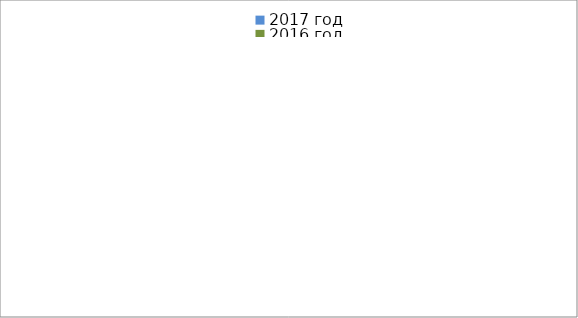
| Category | 2017 год | 2016 год |
|---|---|---|
|  - поджог | 3 | 22 |
|  - неосторожное обращение с огнём | 2 | 17 |
|  - НПТЭ электрооборудования | 7 | 4 |
|  - НПУ и Э печей | 21 | 21 |
|  - НПУ и Э транспортных средств | 32 | 9 |
|   -Шалость с огнем детей | 4 | 4 |
|  -НППБ при эксплуатации эл.приборов | 17 | 4 |
|  - курение | 18 | 6 |
| - прочие | 32 | 43 |
| - не установленные причины | 0 | 11 |